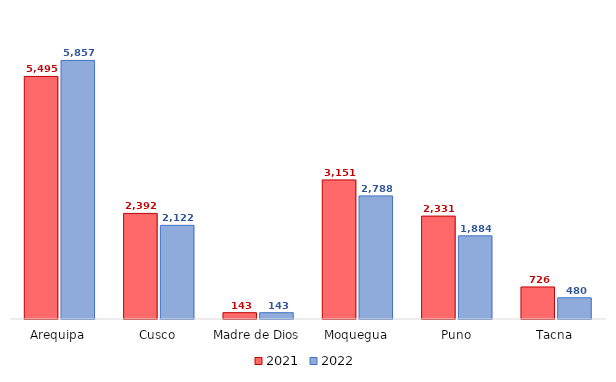
| Category | 2021 | 2022 |
|---|---|---|
| Arequipa | 5494.8 | 5857.42 |
| Cusco | 2392.05 | 2121.86 |
| Madre de Dios | 143.13 | 143.14 |
| Moquegua | 3150.6 | 2788.2 |
| Puno | 2330.99 | 1883.52 |
| Tacna | 725.63 | 480.04 |